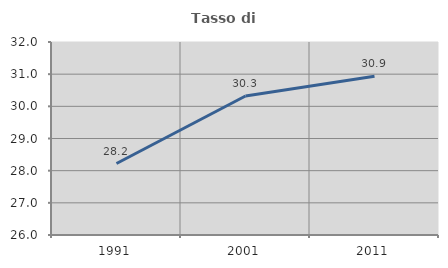
| Category | Tasso di occupazione   |
|---|---|
| 1991.0 | 28.221 |
| 2001.0 | 30.32 |
| 2011.0 | 30.936 |